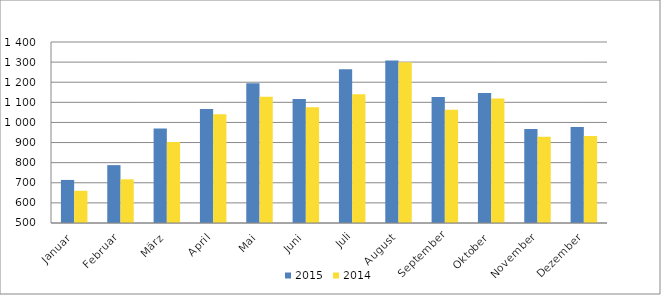
| Category | 2015 | 2014 |
|---|---|---|
| Januar | 714168 | 660302 |
| Februar | 787797 | 717273 |
| März | 969588 | 902957 |
| April | 1066263 | 1040794 |
| Mai | 1194498 | 1128166 |
| Juni | 1117078 | 1075592 |
| Juli | 1264939 | 1140641 |
| August | 1308161 | 1298802 |
| September | 1126323 | 1063395 |
| Oktober | 1145915 | 1118560 |
| November | 967393 | 929110 |
| Dezember | 977172 | 932562 |